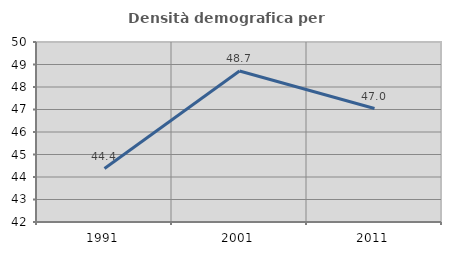
| Category | Densità demografica |
|---|---|
| 1991.0 | 44.375 |
| 2001.0 | 48.712 |
| 2011.0 | 47.044 |